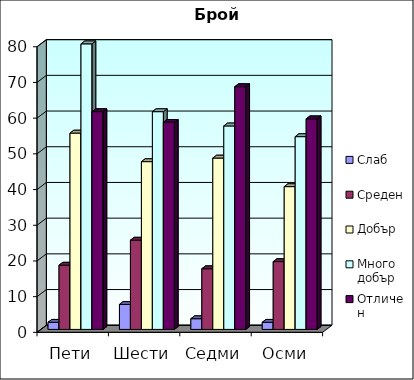
| Category | Слаб | Среден | Добър | Много добър | Отличен |
|---|---|---|---|---|---|
| Пети | 2 | 18 | 55 | 80 | 61 |
| Шести | 7 | 25 | 47 | 61 | 58 |
| Седми | 3 | 17 | 48 | 57 | 68 |
| Осми | 2 | 19 | 40 | 54 | 59 |